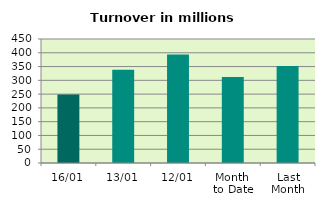
| Category | Series 0 |
|---|---|
| 16/01 | 248.974 |
| 13/01 | 338.575 |
| 12/01 | 393.781 |
| Month 
to Date | 312.003 |
| Last
Month | 352.227 |